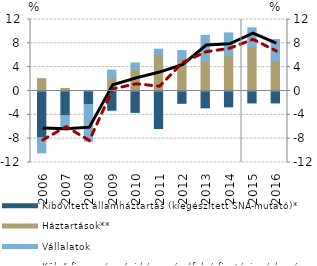
| Category | Kibővített államháztartás (kiegészített SNA-mutató)* | Háztartások** | Vállalatok |
|---|---|---|---|
| 2006.0 | -7.826 | 2.072 | -2.551 |
| 2007.0 | -4.125 | 0.433 | -2.38 |
| 2008.0 | -2.271 | 0.047 | -6.155 |
| 2009.0 | -3.23 | 2.203 | 1.297 |
| 2010.0 | -3.588 | 3.571 | 1.147 |
| 2011.0 | -6.299 | 6.032 | 0.988 |
| 2012.0 | -2.063 | 5.213 | 1.574 |
| 2013.0 | -2.829 | 5.027 | 4.314 |
| 2014.0 | -2.661 | 5.946 | 3.795 |
| 2015.0 | -2.008 | 7.42 | 3.179 |
| 2016.0 | -2.001 | 5.106 | 3.527 |